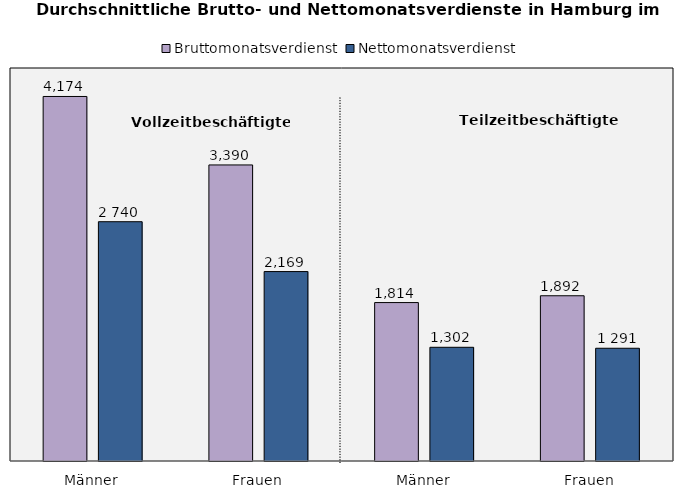
| Category | Bruttomonatsverdienst | Nettomonatsverdienst |
|---|---|---|
| Männer | 4174 | 2740 |
| Frauen | 3390 | 2169 |
| Männer | 1814 | 1302 |
| Frauen | 1892 | 1291 |